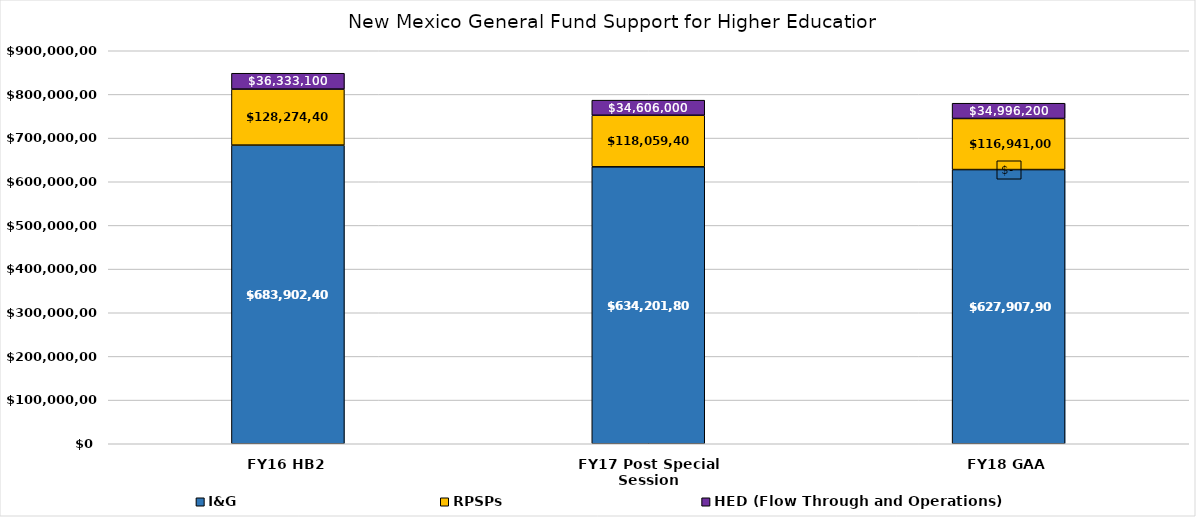
| Category | I&G | RPSPs folded into I&G | RPSPs | HED (Flow Through and Operations) |
|---|---|---|---|---|
| FY16 HB2 | 683902400 | 0 | 128274400 | 36333100 |
| FY17 Post Special Session | 634201800 | 0 | 118059400 | 34606000 |
| FY18 GAA | 627907900 | 0 | 116941000 | 34996200 |